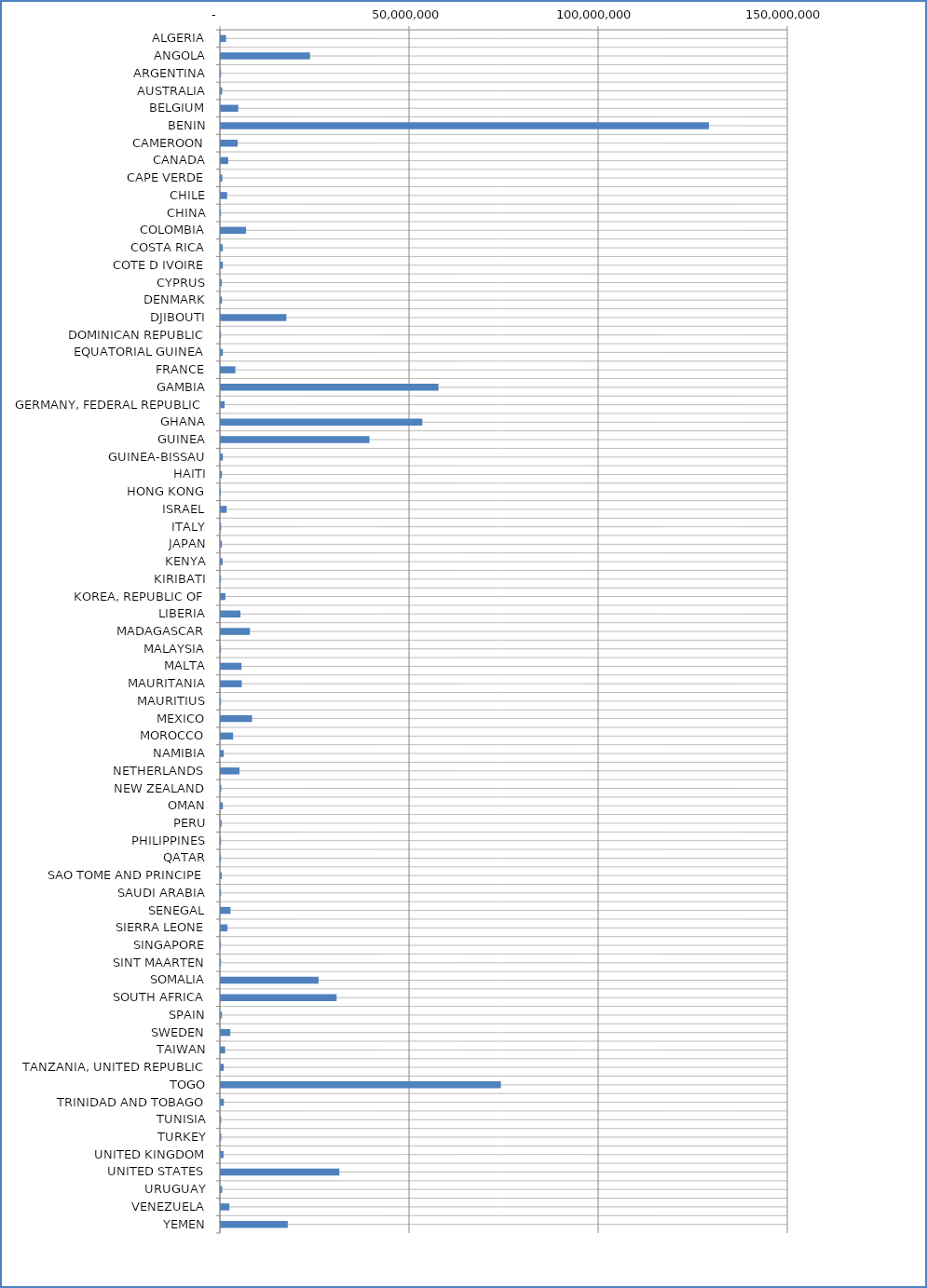
| Category | Series 0 |
|---|---|
| ALGERIA | 1381131 |
| ANGOLA | 23589901 |
| ARGENTINA | 57561 |
| AUSTRALIA | 355575 |
| BELGIUM | 4613556 |
| BENIN | 129042532 |
| CAMEROON | 4468744 |
| CANADA | 1960111 |
| CAPE VERDE | 406230 |
| CHILE | 1666020 |
| CHINA | 46951 |
| COLOMBIA | 6662660 |
| COSTA RICA | 523666 |
| COTE D IVOIRE | 541641 |
| CYPRUS | 260842 |
| DENMARK | 306270 |
| DJIBOUTI | 17334602 |
| DOMINICAN REPUBLIC | 52166 |
| EQUATORIAL GUINEA | 531660 |
| FRANCE | 3853961 |
| GAMBIA | 57551599 |
| GERMANY, FEDERAL REPUBLIC | 1009608 |
| GHANA | 53292303 |
| GUINEA | 39298313 |
| GUINEA-BISSAU | 541720 |
| HAITI | 298188 |
| HONG KONG | 8092 |
| ISRAEL | 1561162 |
| ITALY | 100320 |
| JAPAN | 283248 |
| KENYA | 469591 |
| KIRIBATI | 45135 |
| KOREA, REPUBLIC OF | 1214289 |
| LIBERIA | 5200031 |
| MADAGASCAR | 7708798 |
| MALAYSIA | 41875 |
| MALTA | 5471422 |
| MAURITANIA | 5525234 |
| MAURITIUS | 52277 |
| MEXICO | 8275590 |
| MOROCCO | 3249960 |
| NAMIBIA | 783120 |
| NETHERLANDS | 4953946 |
| NEW ZEALAND | 119868 |
| OMAN | 541728 |
| PERU | 202320 |
| PHILIPPINES | 60600 |
| QATAR | 52240 |
| SAO TOME AND PRINCIPE | 243972 |
| SAUDI ARABIA | 60696 |
| SENEGAL | 2573012 |
| SIERRA LEONE | 1754604 |
| SINGAPORE | 19327 |
| SINT MAARTEN | 52277 |
| SOMALIA | 25841412 |
| SOUTH AFRICA | 30615553 |
| SPAIN | 284401 |
| SWEDEN | 2508000 |
| TAIWAN | 1145336 |
| TANZANIA, UNITED REPUBLIC | 782490 |
| TOGO | 74048192 |
| TRINIDAD AND TOBAGO | 815019 |
| TUNISIA | 100880 |
| TURKEY | 130420 |
| UNITED KINGDOM | 731300 |
| UNITED STATES | 31348217 |
| URUGUAY | 360900 |
| VENEZUELA | 2274336 |
| YEMEN | 17712744 |